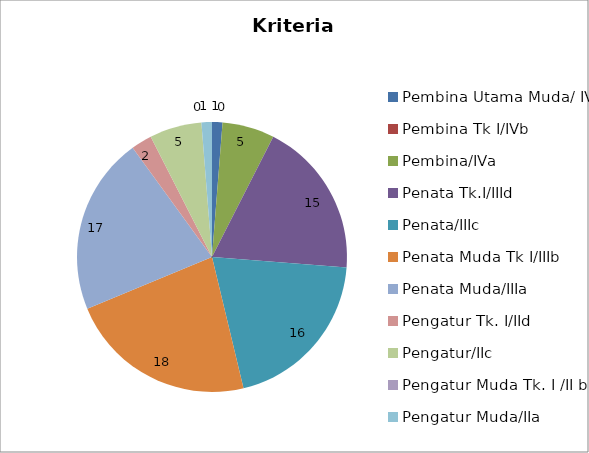
| Category | Jumlah |
|---|---|
| Pembina Utama Muda/ IVc | 1 |
| Pembina Tk I/IVb | 0 |
| Pembina/IVa | 5 |
| Penata Tk.I/IIId | 15 |
| Penata/IIIc | 16 |
| Penata Muda Tk I/IIIb | 18 |
| Penata Muda/IIIa | 17 |
| Pengatur Tk. I/IId | 2 |
| Pengatur/IIc | 5 |
| Pengatur Muda Tk. I /II b | 0 |
| Pengatur Muda/IIa | 1 |